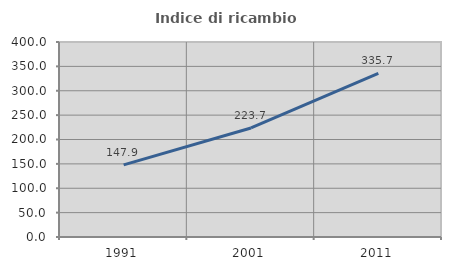
| Category | Indice di ricambio occupazionale  |
|---|---|
| 1991.0 | 147.883 |
| 2001.0 | 223.675 |
| 2011.0 | 335.745 |